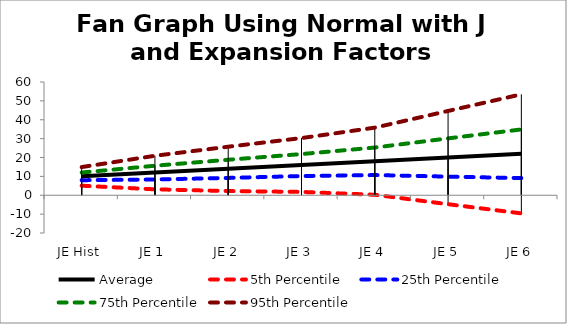
| Category | Average | 5th Percentile | 25th Percentile | 75th Percentile | 95th Percentile |
|---|---|---|---|---|---|
| JE Hist | 10.004 | 5.059 | 7.98 | 12.025 | 14.928 |
| JE 1 | 12.001 | 3.136 | 8.351 | 15.642 | 20.913 |
| JE 2 | 13.996 | 2.232 | 9.183 | 18.81 | 25.722 |
| JE 3 | 15.984 | 1.765 | 10.18 | 21.819 | 30.291 |
| JE 4 | 18.01 | 0.258 | 10.696 | 25.275 | 35.814 |
| JE 5 | 20.008 | -4.739 | 9.877 | 30.135 | 44.66 |
| JE 6 | 21.992 | -9.598 | 9.083 | 34.869 | 53.475 |